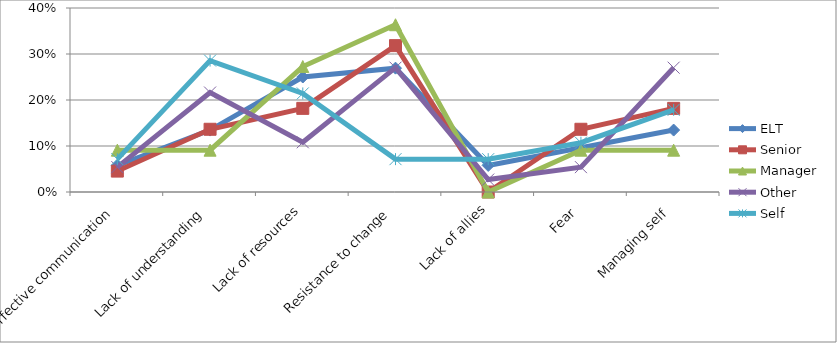
| Category | ELT | Senior | Manager | Other | Self |
|---|---|---|---|---|---|
| Ineffective communication | 0.058 | 0.045 | 0.091 | 0.054 | 0.071 |
| Lack of understanding | 0.135 | 0.136 | 0.091 | 0.216 | 0.286 |
| Lack of resources | 0.25 | 0.182 | 0.273 | 0.108 | 0.214 |
| Resistance to change | 0.269 | 0.318 | 0.364 | 0.27 | 0.071 |
| Lack of allies | 0.058 | 0 | 0 | 0.027 | 0.071 |
| Fear | 0.096 | 0.136 | 0.091 | 0.054 | 0.107 |
| Managing self | 0.135 | 0.182 | 0.091 | 0.27 | 0.179 |